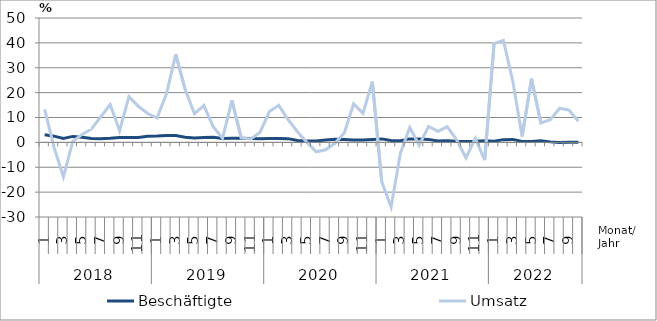
| Category | Beschäftigte | Umsatz |
|---|---|---|
| 0 | 3.1 | 13.3 |
| 1 | 2.5 | -2 |
| 2 | 1.6 | -13.9 |
| 3 | 2.4 | 0.4 |
| 4 | 2.1 | 3.2 |
| 5 | 1.6 | 5.4 |
| 6 | 1.5 | 10.3 |
| 7 | 1.7 | 15.2 |
| 8 | 2 | 4.7 |
| 9 | 2 | 18.4 |
| 10 | 2 | 14.5 |
| 11 | 2.5 | 11.6 |
| 12 | 2.6 | 9.8 |
| 13 | 2.8 | 19.4 |
| 14 | 2.8 | 35.4 |
| 15 | 2.1 | 21.3 |
| 16 | 1.8 | 11.5 |
| 17 | 2 | 14.8 |
| 18 | 2.1 | 6.3 |
| 19 | 1.6 | 1.7 |
| 20 | 1.7 | 16.9 |
| 21 | 1.7 | 1.8 |
| 22 | 1.6 | 1.4 |
| 23 | 1.5 | 4 |
| 24 | 1.6 | 12.4 |
| 25 | 1.6 | 14.9 |
| 26 | 1.5 | 9.1 |
| 27 | 0.8 | 4.3 |
| 28 | 0.6 | 0.1 |
| 29 | 0.6 | -3.8 |
| 30 | 1 | -3 |
| 31 | 1.3 | -0.4 |
| 32 | 1.2 | 3.8 |
| 33 | 1 | 15.5 |
| 34 | 1 | 11.7 |
| 35 | 1.2 | 24.4 |
| 36 | 1.4 | -15.8 |
| 37 | 0.8 | -26 |
| 38 | 0.7 | -4.3 |
| 39 | 1.4 | 6 |
| 40 | 1.4 | -1.1 |
| 41 | 1.2 | 6.4 |
| 42 | 0.6 | 4.4 |
| 43 | 0.7 | 6.3 |
| 44 | 0.5 | 1 |
| 45 | 0.4 | -6.2 |
| 46 | 0.5 | 1.6 |
| 47 | 0.7 | -7.1 |
| 48 | 0.5 | 39.7 |
| 49 | 1.1 | 41 |
| 50 | 1.2 | 24.6 |
| 51 | 0.4 | 2.4 |
| 52 | 0.4 | 25.6 |
| 53 | 0.7 | 7.8 |
| 54 | 0.2 | 9.1 |
| 55 | 0 | 13.7 |
| 56 | 0.1 | 13 |
| 57 | 0.1 | 8.5 |